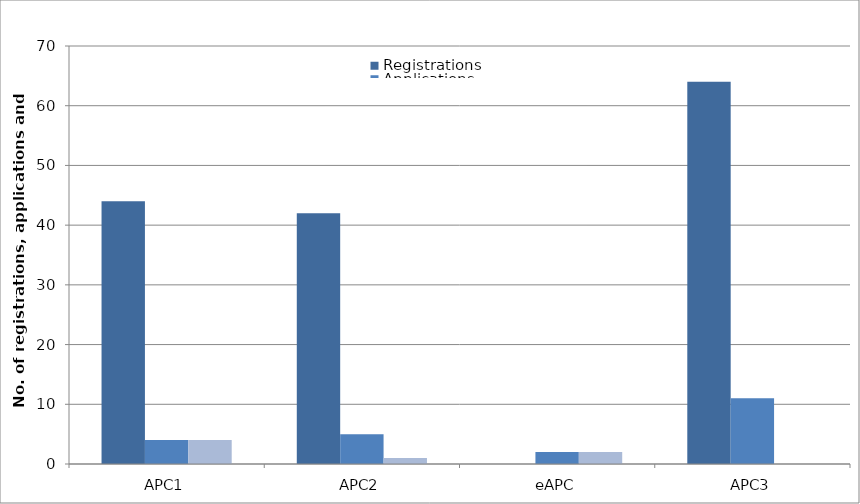
| Category | Registrations | Applications | Awards |
|---|---|---|---|
| APC1 | 44 | 4 | 4 |
| APC2 | 42 | 5 | 1 |
| eAPC | 0 | 2 | 2 |
| APC3 | 64 | 11 | 0 |